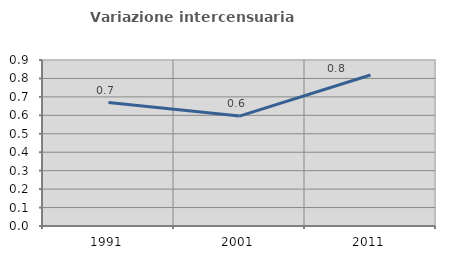
| Category | Variazione intercensuaria annua |
|---|---|
| 1991.0 | 0.67 |
| 2001.0 | 0.596 |
| 2011.0 | 0.819 |